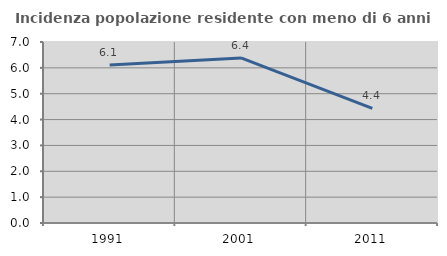
| Category | Incidenza popolazione residente con meno di 6 anni |
|---|---|
| 1991.0 | 6.106 |
| 2001.0 | 6.384 |
| 2011.0 | 4.434 |